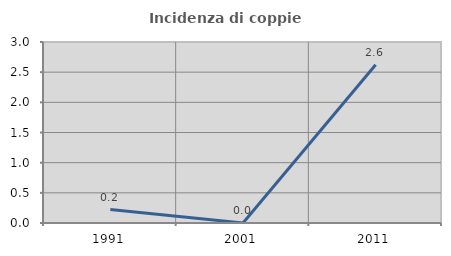
| Category | Incidenza di coppie miste |
|---|---|
| 1991.0 | 0.223 |
| 2001.0 | 0 |
| 2011.0 | 2.624 |